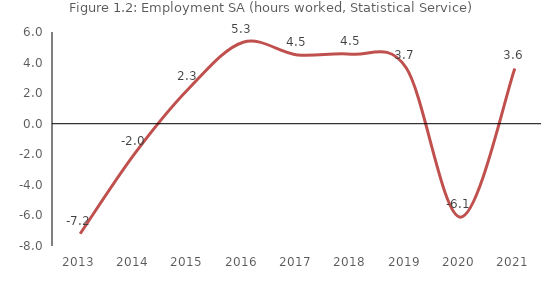
| Category | Series 1 |
|---|---|
| 2013.0 | -7.199 |
| 2014.0 | -1.976 |
| 2015.0 | 2.303 |
| 2016.0 | 5.333 |
| 2017.0 | 4.501 |
| 2018.0 | 4.55 |
| 2019.0 | 3.659 |
| 2020.0 | -6.114 |
| 2021.0 | 3.618 |